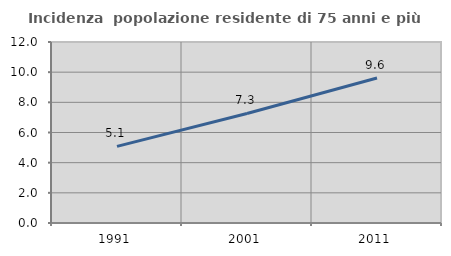
| Category | Incidenza  popolazione residente di 75 anni e più |
|---|---|
| 1991.0 | 5.079 |
| 2001.0 | 7.264 |
| 2011.0 | 9.611 |